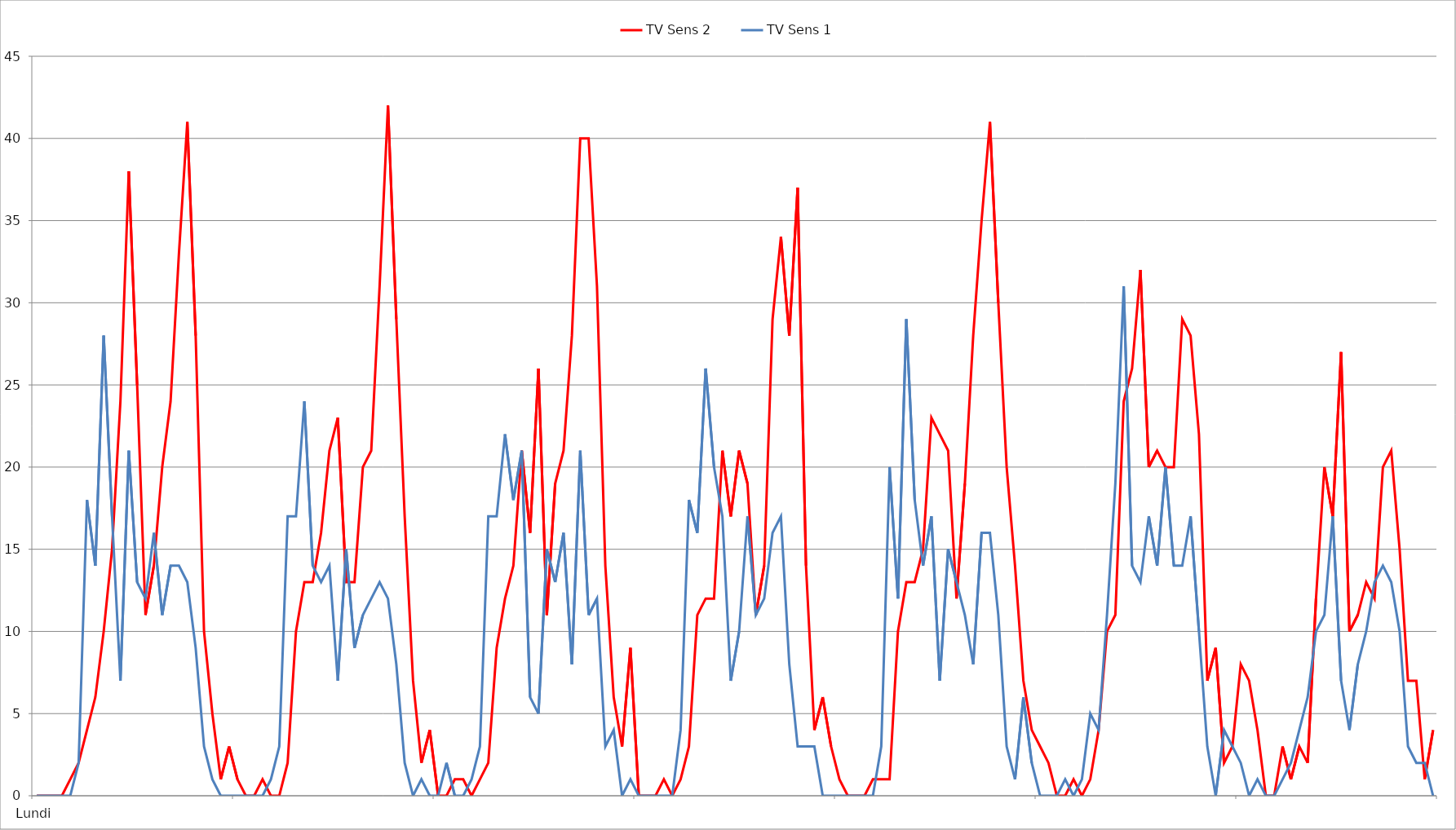
| Category | TV Sens 2 | TV Sens 1 |
|---|---|---|
| 0 | 0 | 0 |
| 1 | 0 | 0 |
| 2 | 0 | 0 |
| 3 | 0 | 0 |
| 4 | 1 | 0 |
| 5 | 2 | 2 |
| 6 | 4 | 18 |
| 7 | 6 | 14 |
| 8 | 10 | 28 |
| 9 | 15 | 17 |
| 10 | 24 | 7 |
| 11 | 38 | 21 |
| 12 | 25 | 13 |
| 13 | 11 | 12 |
| 14 | 14 | 16 |
| 15 | 20 | 11 |
| 16 | 24 | 14 |
| 17 | 33 | 14 |
| 18 | 41 | 13 |
| 19 | 28 | 9 |
| 20 | 10 | 3 |
| 21 | 5 | 1 |
| 22 | 1 | 0 |
| 23 | 3 | 0 |
| 24 | 1 | 0 |
| 25 | 0 | 0 |
| 26 | 0 | 0 |
| 27 | 1 | 0 |
| 28 | 0 | 1 |
| 29 | 0 | 3 |
| 30 | 2 | 17 |
| 31 | 10 | 17 |
| 32 | 13 | 24 |
| 33 | 13 | 14 |
| 34 | 16 | 13 |
| 35 | 21 | 14 |
| 36 | 23 | 7 |
| 37 | 13 | 15 |
| 38 | 13 | 9 |
| 39 | 20 | 11 |
| 40 | 21 | 12 |
| 41 | 31 | 13 |
| 42 | 42 | 12 |
| 43 | 29 | 8 |
| 44 | 17 | 2 |
| 45 | 7 | 0 |
| 46 | 2 | 1 |
| 47 | 4 | 0 |
| 48 | 0 | 0 |
| 49 | 0 | 2 |
| 50 | 1 | 0 |
| 51 | 1 | 0 |
| 52 | 0 | 1 |
| 53 | 1 | 3 |
| 54 | 2 | 17 |
| 55 | 9 | 17 |
| 56 | 12 | 22 |
| 57 | 14 | 18 |
| 58 | 21 | 21 |
| 59 | 16 | 6 |
| 60 | 26 | 5 |
| 61 | 11 | 15 |
| 62 | 19 | 13 |
| 63 | 21 | 16 |
| 64 | 28 | 8 |
| 65 | 40 | 21 |
| 66 | 40 | 11 |
| 67 | 31 | 12 |
| 68 | 14 | 3 |
| 69 | 6 | 4 |
| 70 | 3 | 0 |
| 71 | 9 | 1 |
| 72 | 0 | 0 |
| 73 | 0 | 0 |
| 74 | 0 | 0 |
| 75 | 1 | 0 |
| 76 | 0 | 0 |
| 77 | 1 | 4 |
| 78 | 3 | 18 |
| 79 | 11 | 16 |
| 80 | 12 | 26 |
| 81 | 12 | 20 |
| 82 | 21 | 17 |
| 83 | 17 | 7 |
| 84 | 21 | 10 |
| 85 | 19 | 17 |
| 86 | 11 | 11 |
| 87 | 14 | 12 |
| 88 | 29 | 16 |
| 89 | 34 | 17 |
| 90 | 28 | 8 |
| 91 | 37 | 3 |
| 92 | 14 | 3 |
| 93 | 4 | 3 |
| 94 | 6 | 0 |
| 95 | 3 | 0 |
| 96 | 1 | 0 |
| 97 | 0 | 0 |
| 98 | 0 | 0 |
| 99 | 0 | 0 |
| 100 | 1 | 0 |
| 101 | 1 | 3 |
| 102 | 1 | 20 |
| 103 | 10 | 12 |
| 104 | 13 | 29 |
| 105 | 13 | 18 |
| 106 | 15 | 14 |
| 107 | 23 | 17 |
| 108 | 22 | 7 |
| 109 | 21 | 15 |
| 110 | 12 | 13 |
| 111 | 19 | 11 |
| 112 | 28 | 8 |
| 113 | 35 | 16 |
| 114 | 41 | 16 |
| 115 | 30 | 11 |
| 116 | 20 | 3 |
| 117 | 14 | 1 |
| 118 | 7 | 6 |
| 119 | 4 | 2 |
| 120 | 3 | 0 |
| 121 | 2 | 0 |
| 122 | 0 | 0 |
| 123 | 0 | 1 |
| 124 | 1 | 0 |
| 125 | 0 | 1 |
| 126 | 1 | 5 |
| 127 | 4 | 4 |
| 128 | 10 | 11 |
| 129 | 11 | 19 |
| 130 | 24 | 31 |
| 131 | 26 | 14 |
| 132 | 32 | 13 |
| 133 | 20 | 17 |
| 134 | 21 | 14 |
| 135 | 20 | 20 |
| 136 | 20 | 14 |
| 137 | 29 | 14 |
| 138 | 28 | 17 |
| 139 | 22 | 10 |
| 140 | 7 | 3 |
| 141 | 9 | 0 |
| 142 | 2 | 4 |
| 143 | 3 | 3 |
| 144 | 8 | 2 |
| 145 | 7 | 0 |
| 146 | 4 | 1 |
| 147 | 0 | 0 |
| 148 | 0 | 0 |
| 149 | 3 | 1 |
| 150 | 1 | 2 |
| 151 | 3 | 4 |
| 152 | 2 | 6 |
| 153 | 12 | 10 |
| 154 | 20 | 11 |
| 155 | 17 | 17 |
| 156 | 27 | 7 |
| 157 | 10 | 4 |
| 158 | 11 | 8 |
| 159 | 13 | 10 |
| 160 | 12 | 13 |
| 161 | 20 | 14 |
| 162 | 21 | 13 |
| 163 | 15 | 10 |
| 164 | 7 | 3 |
| 165 | 7 | 2 |
| 166 | 1 | 2 |
| 167 | 4 | 0 |